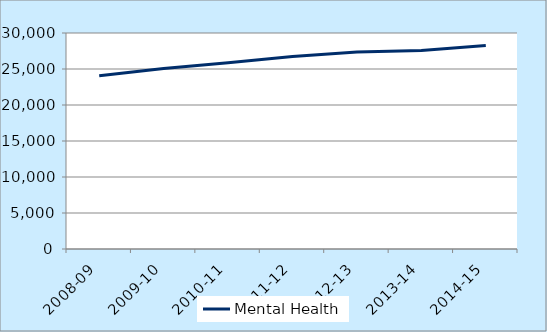
| Category | Mental Health |
|---|---|
| 2008-09 | 24067 |
| 2009-10 | 25069 |
| 2010-11 | 25857 |
| 2011-12 | 26725 |
| 2012-13 | 27349 |
| 2013-14 | 27577 |
| 2014-15 | 28276 |